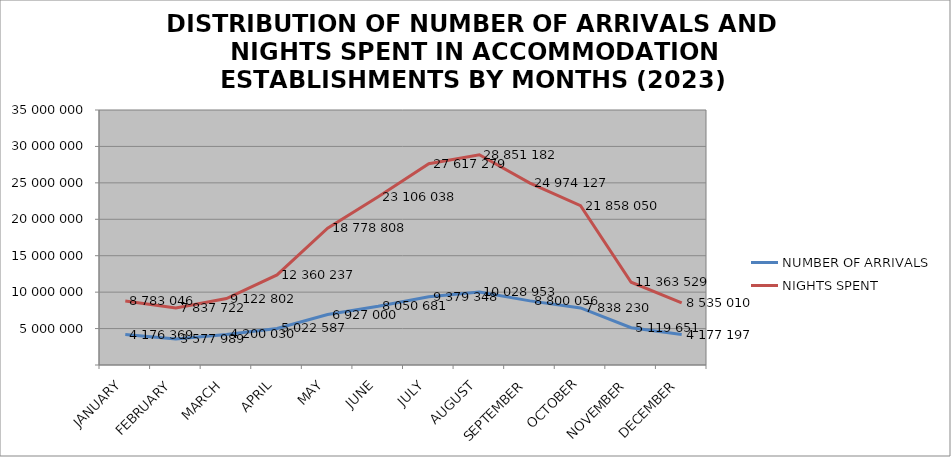
| Category | NUMBER OF ARRIVALS | NIGHTS SPENT |
|---|---|---|
| JANUARY | 4176369 | 8783046 |
| FEBRUARY | 3577989 | 7837722 |
| MARCH | 4200030 | 9122802 |
| APRIL | 5022587 | 12360237 |
| MAY | 6927000 | 18778808 |
| JUNE | 8050681 | 23106038 |
| JULY | 9379348 | 27617279 |
| AUGUST | 10028953 | 28851182 |
| SEPTEMBER | 8800056 | 24974127 |
| OCTOBER | 7838230 | 21858050 |
| NOVEMBER | 5119651 | 11363529 |
| DECEMBER | 4177197 | 8535010 |